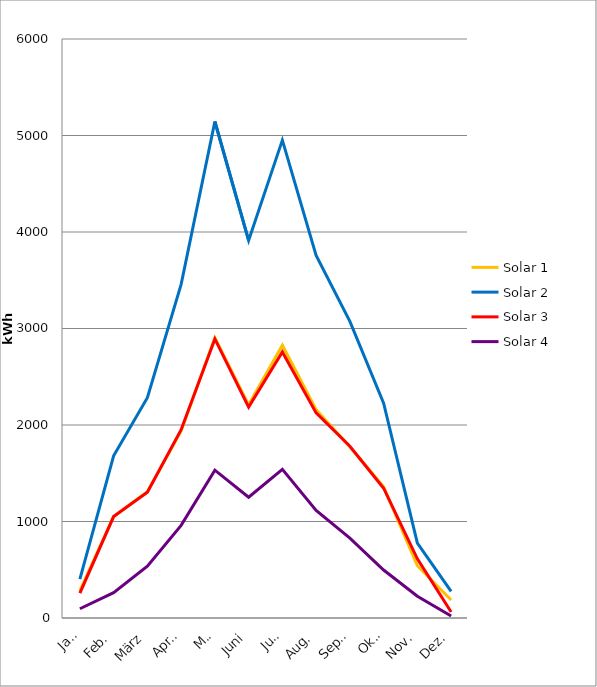
| Category | Solar 1 | Solar 2 | Solar 3 | Solar 4 |
|---|---|---|---|---|
| Jan. | 283 | 403 | 257 | 96 |
| Feb. | 1052 | 1681 | 1051 | 262 |
| März | 1308 | 2283 | 1303 | 537 |
| April | 1939 | 3458 | 1951 | 960 |
| Mai | 2904 | 5145 | 2892 | 1532 |
| Juni | 2209 | 3913 | 2186 | 1251 |
| Juli | 2827 | 4952 | 2756 | 1540 |
| Aug. | 2158 | 3758 | 2125 | 1114 |
| Sept. | 1775 | 3074 | 1780 | 827 |
| Okt. | 1359 | 2227 | 1345 | 497 |
| Nov. | 542 | 777 | 613 | 225 |
| Dez. | 186 | 275 | 62 | 21 |